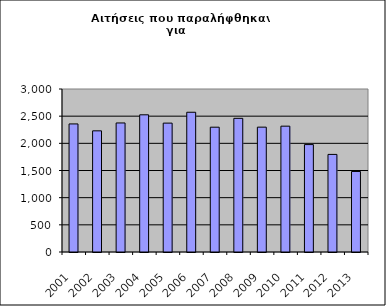
| Category | Series 1 |
|---|---|
| 2001.0 | 2357 |
| 2002.0 | 2230 |
| 2003.0 | 2375 |
| 2004.0 | 2525 |
| 2005.0 | 2372 |
| 2006.0 | 2572 |
| 2007.0 | 2297 |
| 2008.0 | 2460 |
| 2009.0 | 2298 |
| 2010.0 | 2316 |
| 2011.0 | 1977 |
| 2012.0 | 1796 |
| 2013.0 | 1482 |